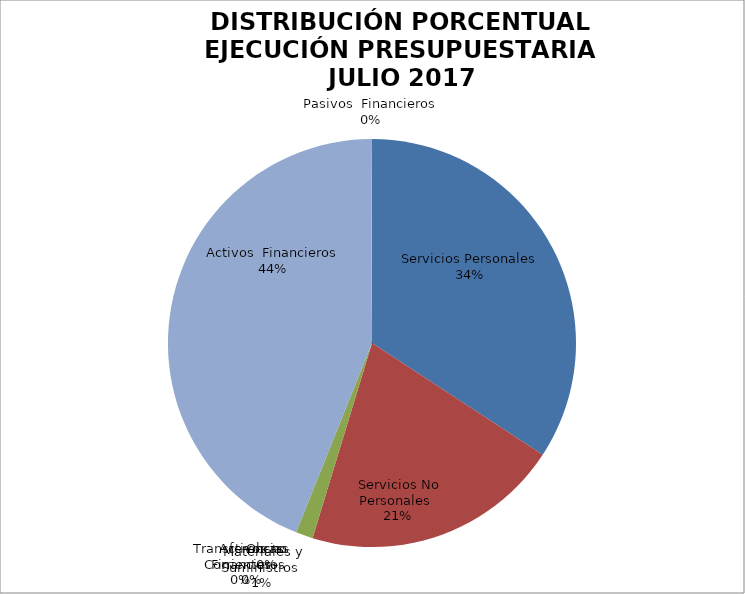
| Category | Series 0 | Series 1 |
|---|---|---|
| Servicios Personales | 11098903.76 | 0.342 |
| Servicios No Personales | 6644841.17 | 0.205 |
| Materiales y Suministros | 439392.86 | 0.014 |
| Transferencias Corrientes | 0 | 0 |
| Activos no Financieros | 0 | 0 |
| Obras | 0 | 0 |
| Activos  Financieros | 14225701.35 | 0.439 |
| Pasivos  Financieros | 24400 | 0.001 |